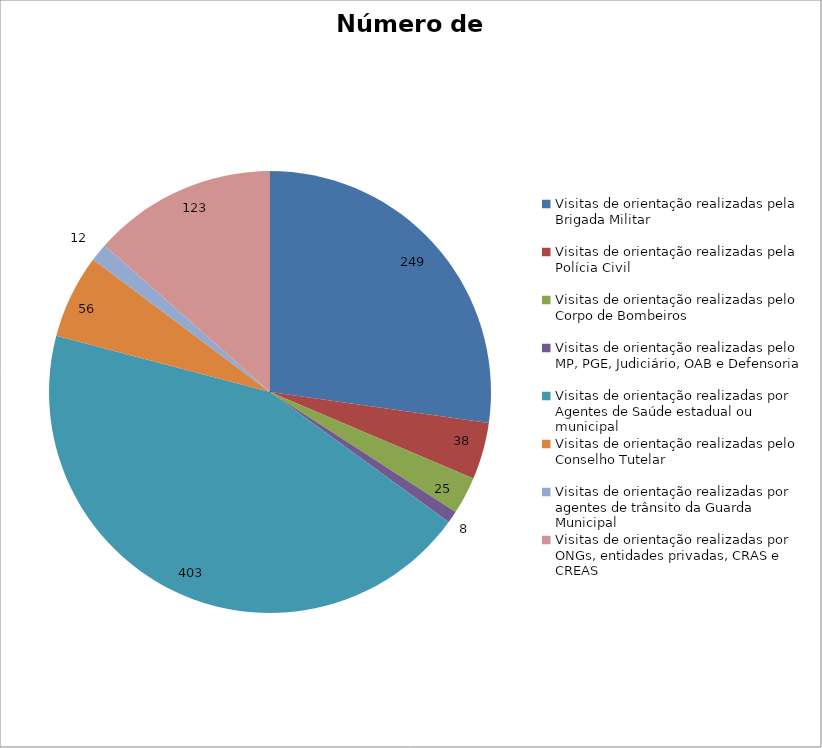
| Category | Número de Ações |
|---|---|
| Visitas de orientação realizadas pela Brigada Militar | 249 |
| Visitas de orientação realizadas pela Polícia Civil | 38 |
| Visitas de orientação realizadas pelo Corpo de Bombeiros | 25 |
| Visitas de orientação realizadas pelo MP, PGE, Judiciário, OAB e Defensoria | 8 |
| Visitas de orientação realizadas por Agentes de Saúde estadual ou municipal | 403 |
| Visitas de orientação realizadas pelo Conselho Tutelar | 56 |
| Visitas de orientação realizadas por agentes de trânsito da Guarda Municipal | 12 |
| Visitas de orientação realizadas por ONGs, entidades privadas, CRAS e CREAS | 123 |